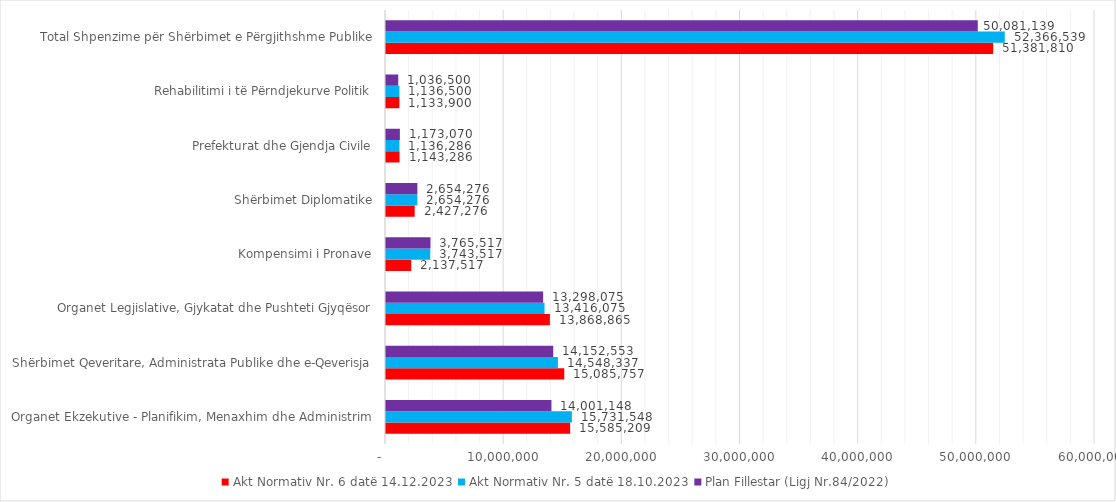
| Category | Akt Normativ Nr. 6 datë 14.12.2023 | Akt Normativ Nr. 5 datë 18.10.2023 | Plan Fillestar (Ligj Nr.84/2022) |
|---|---|---|---|
| Organet Ekzekutive - Planifikim, Menaxhim dhe Administrim | 15585209 | 15731548.379 | 14001148.379 |
| Shërbimet Qeveritare, Administrata Publike dhe e-Qeverisja | 15085757 | 14548337 | 14152553 |
| Organet Legjislative, Gjykatat dhe Pushteti Gjyqësor | 13868865 | 13416075 | 13298074.621 |
| Kompensimi i Pronave | 2137517 | 3743517 | 3765517 |
| Shërbimet Diplomatike | 2427276 | 2654276 | 2654276 |
| Prefekturat dhe Gjendja Civile | 1143286 | 1136286 | 1173070 |
| Rehabilitimi i të Përndjekurve Politik | 1133900 | 1136500 | 1036500 |
| Total Shpenzime për Shërbimet e Përgjithshme Publike | 51381810 | 52366539.379 | 50081139 |